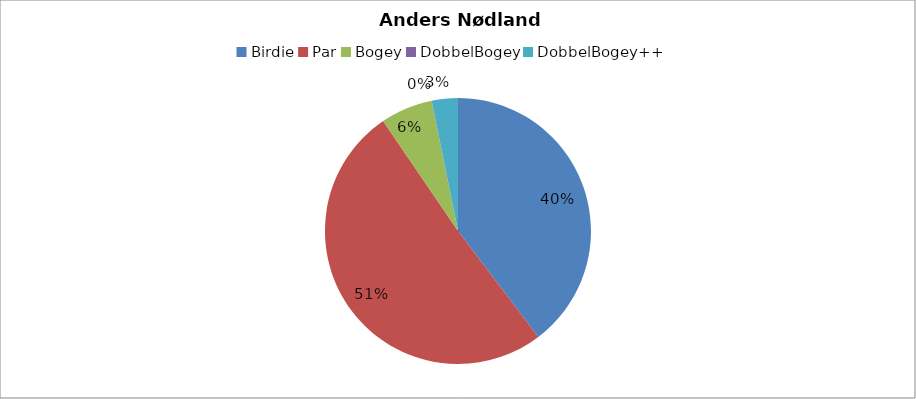
| Category | Anders Nødland Danielsen |
|---|---|
| Birdie | 25 |
| Par | 32 |
| Bogey | 4 |
| DobbelBogey | 0 |
| DobbelBogey++ | 2 |